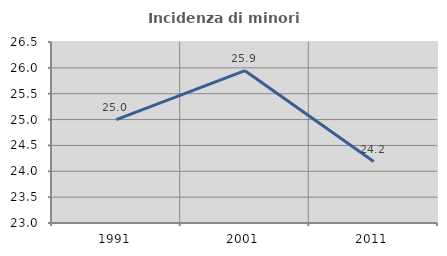
| Category | Incidenza di minori stranieri |
|---|---|
| 1991.0 | 25 |
| 2001.0 | 25.946 |
| 2011.0 | 24.188 |